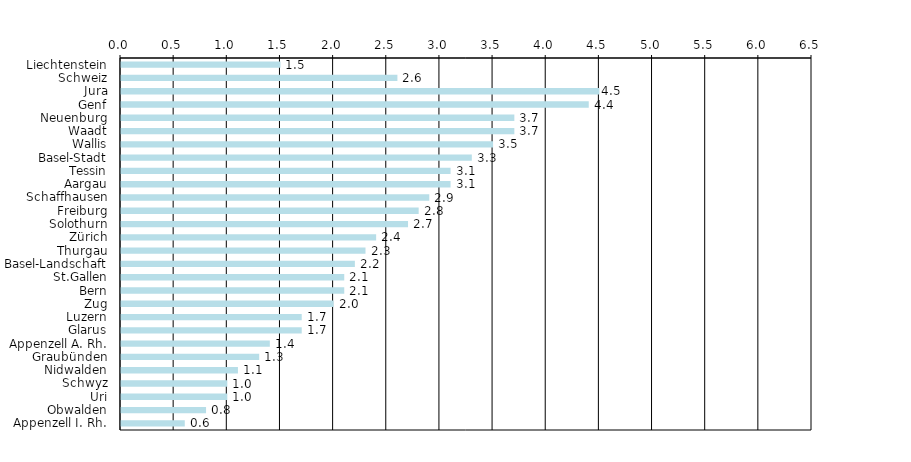
| Category | Series 0 |
|---|---|
| Liechtenstein | 1.5 |
| Schweiz | 2.6 |
| Jura | 4.5 |
| Genf | 4.4 |
| Neuenburg | 3.7 |
| Waadt | 3.7 |
| Wallis | 3.5 |
| Basel-Stadt | 3.3 |
| Tessin | 3.1 |
| Aargau | 3.1 |
| Schaffhausen | 2.9 |
| Freiburg | 2.8 |
| Solothurn | 2.7 |
| Zürich | 2.4 |
| Thurgau | 2.3 |
| Basel-Landschaft | 2.2 |
| St.Gallen | 2.1 |
| Bern | 2.1 |
| Zug | 2 |
| Luzern | 1.7 |
| Glarus | 1.7 |
| Appenzell A. Rh. | 1.4 |
| Graubünden | 1.3 |
| Nidwalden | 1.1 |
| Schwyz | 1 |
| Uri | 1 |
| Obwalden | 0.8 |
| Appenzell I. Rh. | 0.6 |